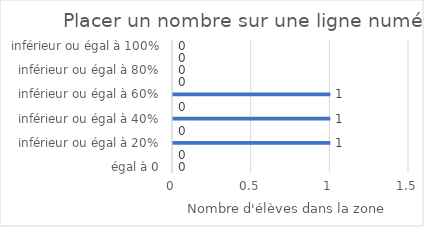
| Category | Placer un nombre sur une ligne numérique |
|---|---|
| égal à 0 | 0 |
| inférieur ou égal à 10% | 0 |
| inférieur ou égal à 20% | 1 |
| inférieur ou égal à 30% | 0 |
| inférieur ou égal à 40% | 1 |
| inférieur ou égal à 50% | 0 |
| inférieur ou égal à 60% | 1 |
| inférieur ou égal à 70% | 0 |
| inférieur ou égal à 80% | 0 |
| inférieur ou égal à 90% | 0 |
| inférieur ou égal à 100% | 0 |